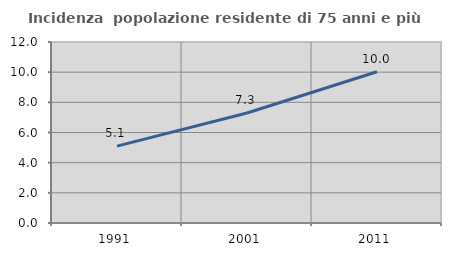
| Category | Incidenza  popolazione residente di 75 anni e più |
|---|---|
| 1991.0 | 5.097 |
| 2001.0 | 7.29 |
| 2011.0 | 10.026 |